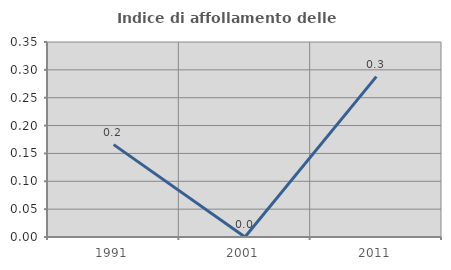
| Category | Indice di affollamento delle abitazioni  |
|---|---|
| 1991.0 | 0.166 |
| 2001.0 | 0 |
| 2011.0 | 0.288 |